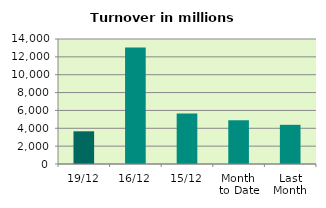
| Category | Series 0 |
|---|---|
| 19/12 | 3662.998 |
| 16/12 | 13043.591 |
| 15/12 | 5654.114 |
| Month 
to Date | 4890.815 |
| Last
Month | 4388.555 |